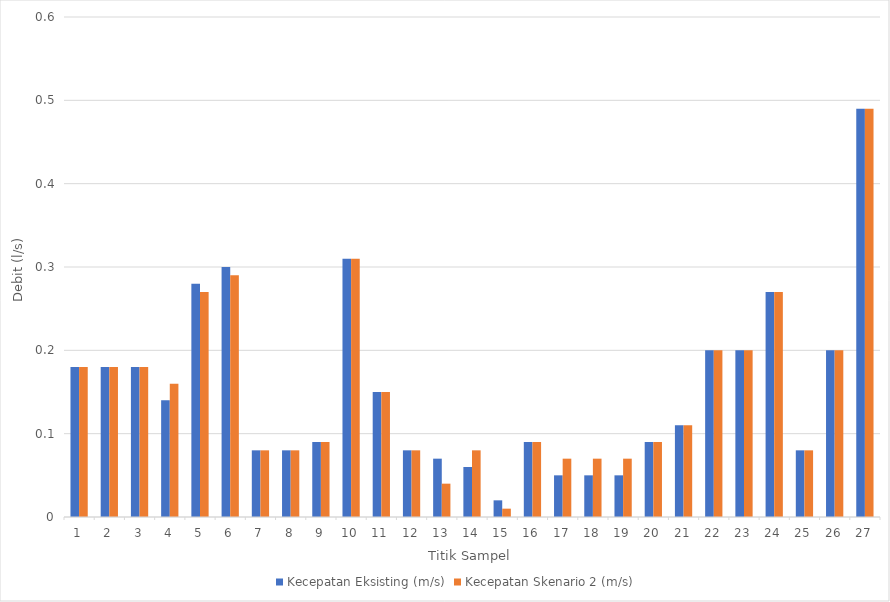
| Category | Kecepatan Eksisting (m/s) | Kecepatan Skenario 2 (m/s) |
|---|---|---|
| 0 | 0.18 | 0.18 |
| 1 | 0.18 | 0.18 |
| 2 | 0.18 | 0.18 |
| 3 | 0.14 | 0.16 |
| 4 | 0.28 | 0.27 |
| 5 | 0.3 | 0.29 |
| 6 | 0.08 | 0.08 |
| 7 | 0.08 | 0.08 |
| 8 | 0.09 | 0.09 |
| 9 | 0.31 | 0.31 |
| 10 | 0.15 | 0.15 |
| 11 | 0.08 | 0.08 |
| 12 | 0.07 | 0.04 |
| 13 | 0.06 | 0.08 |
| 14 | 0.02 | 0.01 |
| 15 | 0.09 | 0.09 |
| 16 | 0.05 | 0.07 |
| 17 | 0.05 | 0.07 |
| 18 | 0.05 | 0.07 |
| 19 | 0.09 | 0.09 |
| 20 | 0.11 | 0.11 |
| 21 | 0.2 | 0.2 |
| 22 | 0.2 | 0.2 |
| 23 | 0.27 | 0.27 |
| 24 | 0.08 | 0.08 |
| 25 | 0.2 | 0.2 |
| 26 | 0.49 | 0.49 |